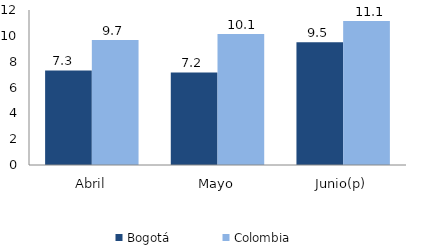
| Category | Bogotá | Colombia |
|---|---|---|
| Abril | 7.325 | 9.68 |
| Mayo | 7.162 | 10.148 |
| Junio(p) | 9.498 | 11.144 |